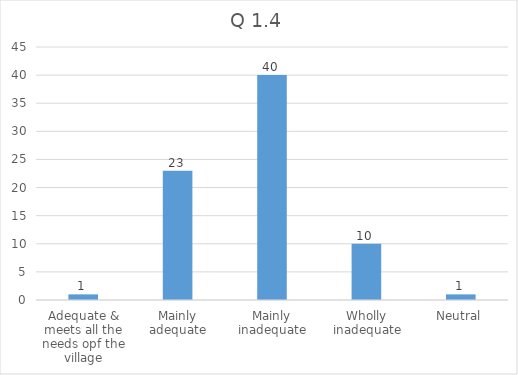
| Category | Total |
|---|---|
| Adequate & meets all the needs opf the village | 1 |
| Mainly adequate | 23 |
| Mainly inadequate | 40 |
| Wholly inadequate | 10 |
| Neutral | 1 |